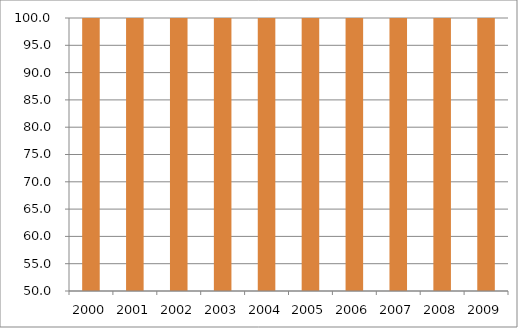
| Category | Região Sudeste |
|---|---|
| 2000.0 | 110.69 |
| 2001.0 | 107.92 |
| 2002.0 | 106.16 |
| 2003.0 | 104.8 |
| 2004.0 | 104.3 |
| 2005.0 | 103.27 |
| 2006.0 | 103.88 |
| 2007.0 | 104.07 |
| 2008.0 | 104.27 |
| 2009.0 | 102.56 |